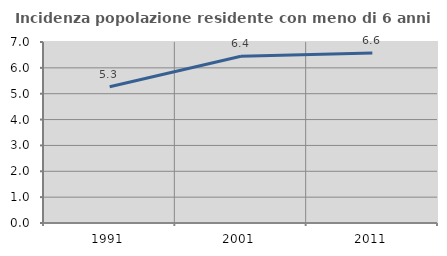
| Category | Incidenza popolazione residente con meno di 6 anni |
|---|---|
| 1991.0 | 5.272 |
| 2001.0 | 6.447 |
| 2011.0 | 6.576 |